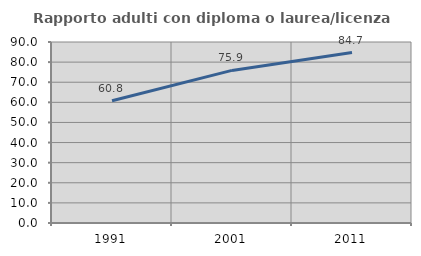
| Category | Rapporto adulti con diploma o laurea/licenza media  |
|---|---|
| 1991.0 | 60.787 |
| 2001.0 | 75.877 |
| 2011.0 | 84.737 |